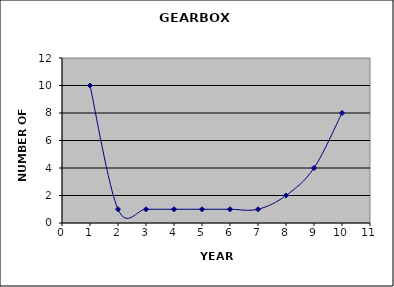
| Category | FAILED |
|---|---|
| 1.0 | 10 |
| 2.0 | 1 |
| 3.0 | 1 |
| 4.0 | 1 |
| 5.0 | 1 |
| 6.0 | 1 |
| 7.0 | 1 |
| 8.0 | 2 |
| 9.0 | 4 |
| 10.0 | 8 |